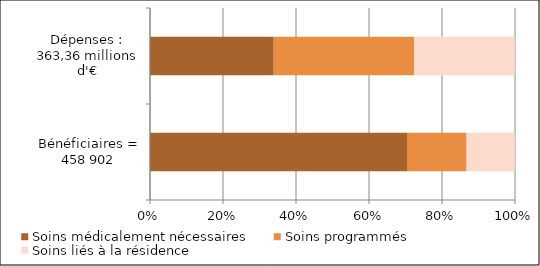
| Category | Soins médicalement nécessaires | Soins programmés | Soins liés à la résidence |
|---|---|---|---|
| Bénéficiaires = 458 902 | 323123 | 75006 | 60773 |
| Dépenses : 363,36 millions d'€ | 123168067.42 | 139635900.65 | 100560933.405 |